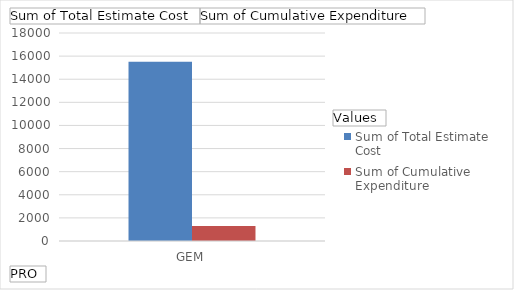
| Category | Sum of Total Estimate Cost | Sum of Cumulative Expenditure  |
|---|---|---|
| GEM | 15505 | 1304.5 |